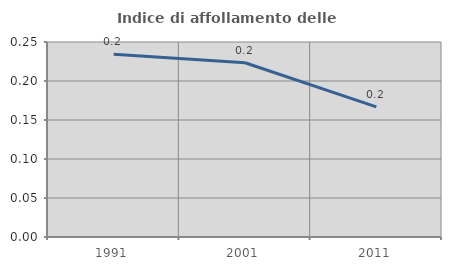
| Category | Indice di affollamento delle abitazioni  |
|---|---|
| 1991.0 | 0.234 |
| 2001.0 | 0.223 |
| 2011.0 | 0.167 |